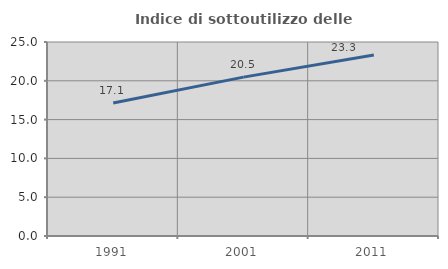
| Category | Indice di sottoutilizzo delle abitazioni  |
|---|---|
| 1991.0 | 17.135 |
| 2001.0 | 20.474 |
| 2011.0 | 23.335 |